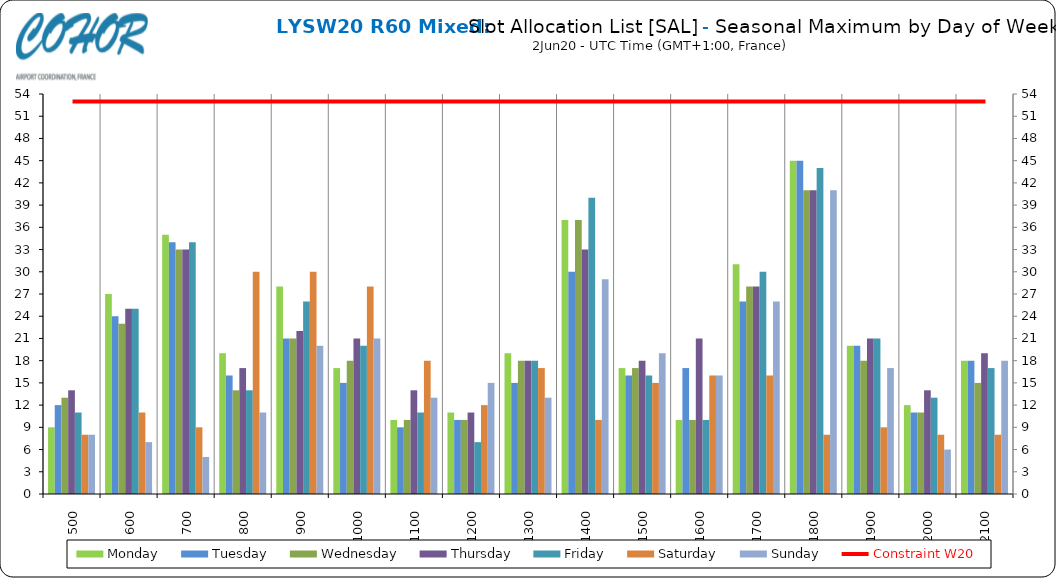
| Category | Monday | Tuesday | Wednesday | Thursday | Friday | Saturday | Sunday |
|---|---|---|---|---|---|---|---|
| 500 | 9 | 12 | 13 | 14 | 11 | 8 | 8 |
| 600 | 27 | 24 | 23 | 25 | 25 | 11 | 7 |
| 700 | 35 | 34 | 33 | 33 | 34 | 9 | 5 |
| 800 | 19 | 16 | 14 | 17 | 14 | 30 | 11 |
| 900 | 28 | 21 | 21 | 22 | 26 | 30 | 20 |
| 1000 | 17 | 15 | 18 | 21 | 20 | 28 | 21 |
| 1100 | 10 | 9 | 10 | 14 | 11 | 18 | 13 |
| 1200 | 11 | 10 | 10 | 11 | 7 | 12 | 15 |
| 1300 | 19 | 15 | 18 | 18 | 18 | 17 | 13 |
| 1400 | 37 | 30 | 37 | 33 | 40 | 10 | 29 |
| 1500 | 17 | 16 | 17 | 18 | 16 | 15 | 19 |
| 1600 | 10 | 17 | 10 | 21 | 10 | 16 | 16 |
| 1700 | 31 | 26 | 28 | 28 | 30 | 16 | 26 |
| 1800 | 45 | 45 | 41 | 41 | 44 | 8 | 41 |
| 1900 | 20 | 20 | 18 | 21 | 21 | 9 | 17 |
| 2000 | 12 | 11 | 11 | 14 | 13 | 8 | 6 |
| 2100 | 18 | 18 | 15 | 19 | 17 | 8 | 18 |